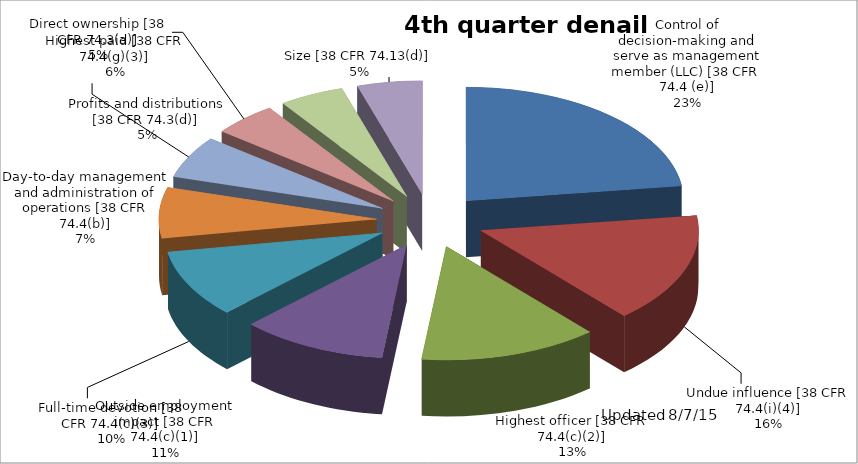
| Category | Series 0 |
|---|---|
| Control of decision-making and serve as management member (LLC) [38 CFR 74.4 (e)] | 19 |
| Undue influence [38 CFR 74.4(i)(4)] | 13 |
| Highest officer [38 CFR 74.4(c)(2)] | 11 |
| Outside employment impact [38 CFR 74.4(c)(1)] | 9 |
| Full-time devotion [38 CFR 74.4(c)(3)] | 8 |
| Day-to-day management and administration of operations [38 CFR 74.4(b)] | 6 |
| Highest paid [38 CFR 74.4(g)(3)] | 5 |
| Direct ownership [38 CFR 74.3(a)] | 4 |
| Profits and distributions [38 CFR 74.3(d)] | 4 |
| Size [38 CFR 74.13(d)] | 4 |